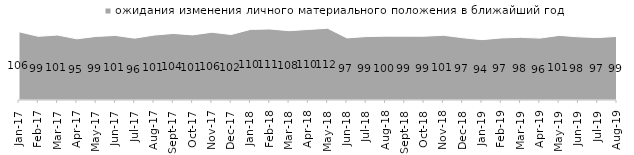
| Category | ожидания изменения личного материального положения в ближайший год |
|---|---|
| 2017-01-01 | 106.3 |
| 2017-02-01 | 99.25 |
| 2017-03-01 | 101.25 |
| 2017-04-01 | 95.3 |
| 2017-05-01 | 99.1 |
| 2017-06-01 | 100.6 |
| 2017-07-01 | 96.4 |
| 2017-08-01 | 101.15 |
| 2017-09-01 | 103.75 |
| 2017-10-01 | 101.45 |
| 2017-11-01 | 105.6 |
| 2017-12-01 | 102.05 |
| 2018-01-01 | 110.05 |
| 2018-02-01 | 110.65 |
| 2018-03-01 | 108 |
| 2018-04-01 | 109.95 |
| 2018-05-01 | 111.8 |
| 2018-06-01 | 96.75 |
| 2018-07-01 | 98.85 |
| 2018-08-01 | 99.5 |
| 2018-09-01 | 99.45 |
| 2018-10-01 | 99.4 |
| 2018-11-01 | 100.848 |
| 2018-12-01 | 97.05 |
| 2019-01-01 | 94.05 |
| 2019-02-01 | 96.75 |
| 2019-03-01 | 97.663 |
| 2019-04-01 | 96.436 |
| 2019-05-01 | 100.693 |
| 2019-06-01 | 98.404 |
| 2019-07-01 | 97.228 |
| 2019-08-01 | 99.151 |